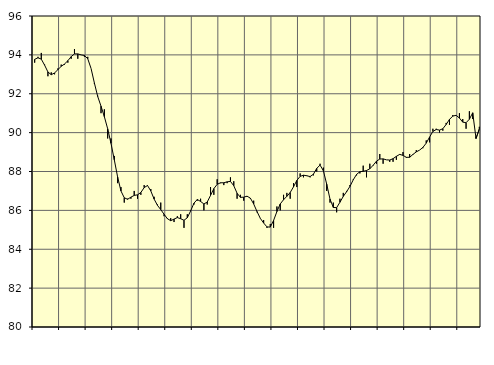
| Category | Piggar | Series 1 |
|---|---|---|
| nan | 93.6 | 93.77 |
| 87.0 | 93.9 | 93.85 |
| 87.0 | 94.1 | 93.78 |
| 87.0 | 93.5 | 93.47 |
| nan | 92.9 | 93.12 |
| 88.0 | 93.1 | 92.98 |
| 88.0 | 93 | 93.07 |
| 88.0 | 93.3 | 93.24 |
| nan | 93.5 | 93.41 |
| 89.0 | 93.5 | 93.53 |
| 89.0 | 93.6 | 93.7 |
| 89.0 | 93.8 | 93.91 |
| nan | 94.3 | 94.05 |
| 90.0 | 93.8 | 94.05 |
| 90.0 | 94 | 94 |
| 90.0 | 93.9 | 93.97 |
| nan | 93.9 | 93.8 |
| 91.0 | 93.3 | 93.3 |
| 91.0 | 92.5 | 92.55 |
| 91.0 | 91.9 | 91.86 |
| nan | 91 | 91.36 |
| 92.0 | 91.2 | 90.82 |
| 92.0 | 89.7 | 90.2 |
| 92.0 | 89.7 | 89.45 |
| nan | 88.8 | 88.6 |
| 93.0 | 87.4 | 87.72 |
| 93.0 | 87.2 | 87 |
| 93.0 | 86.4 | 86.65 |
| nan | 86.6 | 86.57 |
| 94.0 | 86.6 | 86.68 |
| 94.0 | 87 | 86.77 |
| 94.0 | 86.6 | 86.8 |
| nan | 86.8 | 86.92 |
| 95.0 | 87.3 | 87.17 |
| 95.0 | 87.3 | 87.28 |
| 95.0 | 87.1 | 87 |
| nan | 86.7 | 86.58 |
| 96.0 | 86.3 | 86.26 |
| 96.0 | 86.4 | 86.04 |
| 96.0 | 85.7 | 85.8 |
| nan | 85.6 | 85.57 |
| 97.0 | 85.6 | 85.47 |
| 97.0 | 85.4 | 85.55 |
| 97.0 | 85.7 | 85.63 |
| nan | 85.8 | 85.57 |
| 98.0 | 85.1 | 85.49 |
| 98.0 | 85.8 | 85.62 |
| 98.0 | 86 | 85.97 |
| nan | 86.3 | 86.37 |
| 99.0 | 86.5 | 86.56 |
| 99.0 | 86.6 | 86.46 |
| 99.0 | 86 | 86.33 |
| nan | 86.3 | 86.43 |
| 0.0 | 87.2 | 86.77 |
| 0.0 | 86.8 | 87.12 |
| 0.0 | 87.6 | 87.34 |
| nan | 87.4 | 87.42 |
| 1.0 | 87.3 | 87.42 |
| 1.0 | 87.4 | 87.47 |
| 1.0 | 87.7 | 87.49 |
| nan | 87.5 | 87.27 |
| 2.0 | 86.6 | 86.88 |
| 2.0 | 86.8 | 86.67 |
| 2.0 | 86.5 | 86.68 |
| nan | 86.7 | 86.73 |
| 3.0 | 86.6 | 86.63 |
| 3.0 | 86.5 | 86.33 |
| 3.0 | 85.9 | 85.94 |
| nan | 85.6 | 85.59 |
| 4.0 | 85.5 | 85.35 |
| 4.0 | 85.1 | 85.15 |
| 4.0 | 85.3 | 85.14 |
| nan | 85.1 | 85.48 |
| 5.0 | 86.2 | 85.94 |
| 5.0 | 86 | 86.33 |
| 5.0 | 86.8 | 86.55 |
| nan | 86.9 | 86.72 |
| 6.0 | 86.6 | 86.92 |
| 6.0 | 87.4 | 87.21 |
| 6.0 | 87.2 | 87.54 |
| nan | 87.9 | 87.75 |
| 7.0 | 87.7 | 87.81 |
| 7.0 | 87.8 | 87.78 |
| 7.0 | 87.7 | 87.74 |
| nan | 87.8 | 87.86 |
| 8.0 | 88 | 88.16 |
| 8.0 | 88.4 | 88.33 |
| 8.0 | 88.2 | 88.04 |
| nan | 87 | 87.35 |
| 9.0 | 86.4 | 86.58 |
| 9.0 | 86.4 | 86.15 |
| 9.0 | 85.9 | 86.14 |
| nan | 86.6 | 86.42 |
| 10.0 | 86.9 | 86.72 |
| 10.0 | 87 | 86.96 |
| 10.0 | 87.3 | 87.23 |
| nan | 87.6 | 87.57 |
| 11.0 | 87.8 | 87.85 |
| 11.0 | 87.9 | 87.99 |
| 11.0 | 88.3 | 88.01 |
| nan | 87.7 | 88.05 |
| 12.0 | 88.4 | 88.14 |
| 12.0 | 88.3 | 88.32 |
| 12.0 | 88.4 | 88.53 |
| nan | 88.9 | 88.64 |
| 13.0 | 88.4 | 88.65 |
| 13.0 | 88.6 | 88.6 |
| 13.0 | 88.5 | 88.59 |
| nan | 88.5 | 88.66 |
| 14.0 | 88.6 | 88.78 |
| 14.0 | 88.9 | 88.88 |
| 14.0 | 89 | 88.83 |
| nan | 88.7 | 88.73 |
| 15.0 | 88.9 | 88.73 |
| 15.0 | 88.9 | 88.88 |
| 15.0 | 89.1 | 89.01 |
| nan | 89.1 | 89.1 |
| 16.0 | 89.2 | 89.24 |
| 16.0 | 89.6 | 89.46 |
| 16.0 | 89.5 | 89.77 |
| nan | 90.2 | 90.06 |
| 17.0 | 90.2 | 90.16 |
| 17.0 | 90 | 90.13 |
| 17.0 | 90.1 | 90.2 |
| nan | 90.5 | 90.42 |
| 18.0 | 90.4 | 90.68 |
| 18.0 | 90.9 | 90.85 |
| 18.0 | 90.9 | 90.89 |
| nan | 91 | 90.75 |
| 19.0 | 90.7 | 90.54 |
| 19.0 | 90.2 | 90.51 |
| 19.0 | 91.1 | 90.69 |
| nan | 90.7 | 91.02 |
| 20.0 | 89.8 | 89.7 |
| 20.0 | 90.3 | 90.19 |